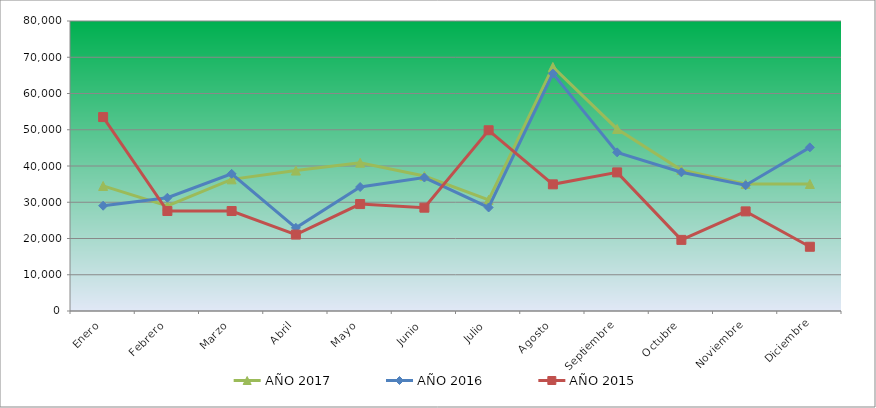
| Category | AÑO 2017 | AÑO 2016 | AÑO 2015 |
|---|---|---|---|
| Enero | 34500 | 29040 | 53500 |
| Febrero | 28980 | 31240 | 27580 |
| Marzo | 36320 | 37840 | 27580 |
| Abril | 38740 | 22940 | 21080 |
| Mayo | 40920 | 34200 | 29500 |
| Junio | 37240 | 36820 | 28500 |
| Julio | 30660 | 28560 | 49860 |
| Agosto | 67320 | 65500 | 34940 |
| Septiembre | 50220 | 43760 | 38240 |
| Octubre | 38900 | 38260 | 19620 |
| Noviembre | 35040 | 34680 | 27480 |
| Diciembre | 35040 | 45140 | 17720 |